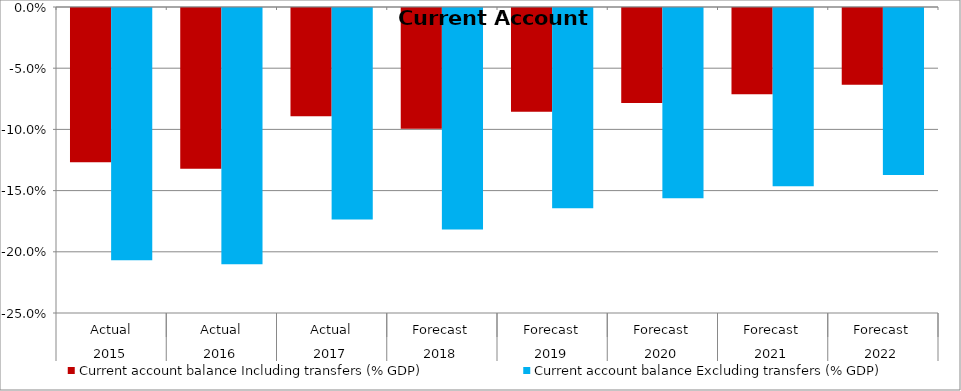
| Category | Current account balance Including transfers (% GDP) | Current account balance Excluding transfers (% GDP) |
|---|---|---|
| 0 | -0.126 | -0.206 |
| 1 | -0.131 | -0.209 |
| 2 | -0.088 | -0.173 |
| 3 | -0.099 | -0.181 |
| 4 | -0.085 | -0.164 |
| 5 | -0.078 | -0.155 |
| 6 | -0.07 | -0.146 |
| 7 | -0.063 | -0.136 |